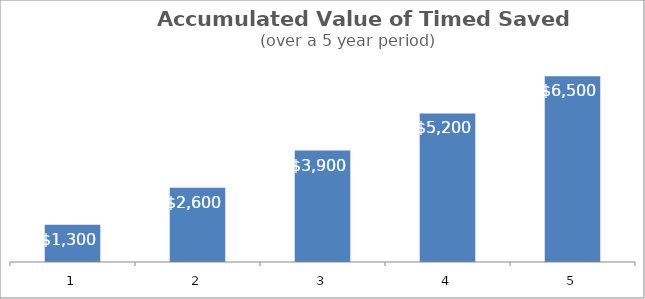
| Category | Value ($) |
|---|---|
| 0 | 1300 |
| 1 | 2600 |
| 2 | 3900 |
| 3 | 5200 |
| 4 | 6500 |